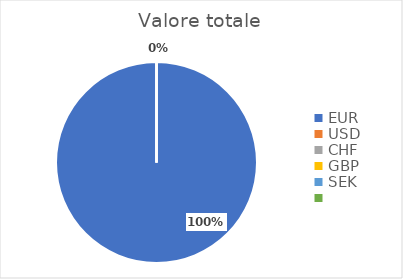
| Category | Valore totale |
|---|---|
| EUR | 3827.55 |
| USD | 0 |
| CHF | 0 |
| GBP | 0 |
| SEK | 0 |